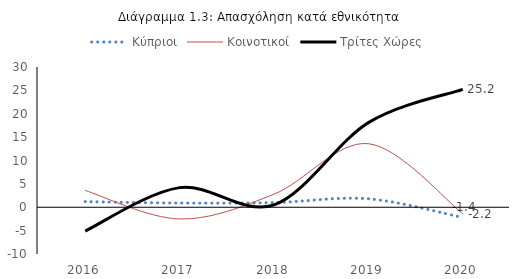
| Category | Κύπριοι | Κοινοτικοί | Τρίτες Χώρες |
|---|---|---|---|
| 2016.0 | 1.2 | 3.6 | -5.1 |
| 2017.0 | 0.9 | -2.5 | 4.2 |
| 2018.0 | 1 | 2.8 | 0.5 |
| 2019.0 | 1.8 | 13.6 | 18.1 |
| 2020.0 | -2.2 | -1.4 | 25.2 |